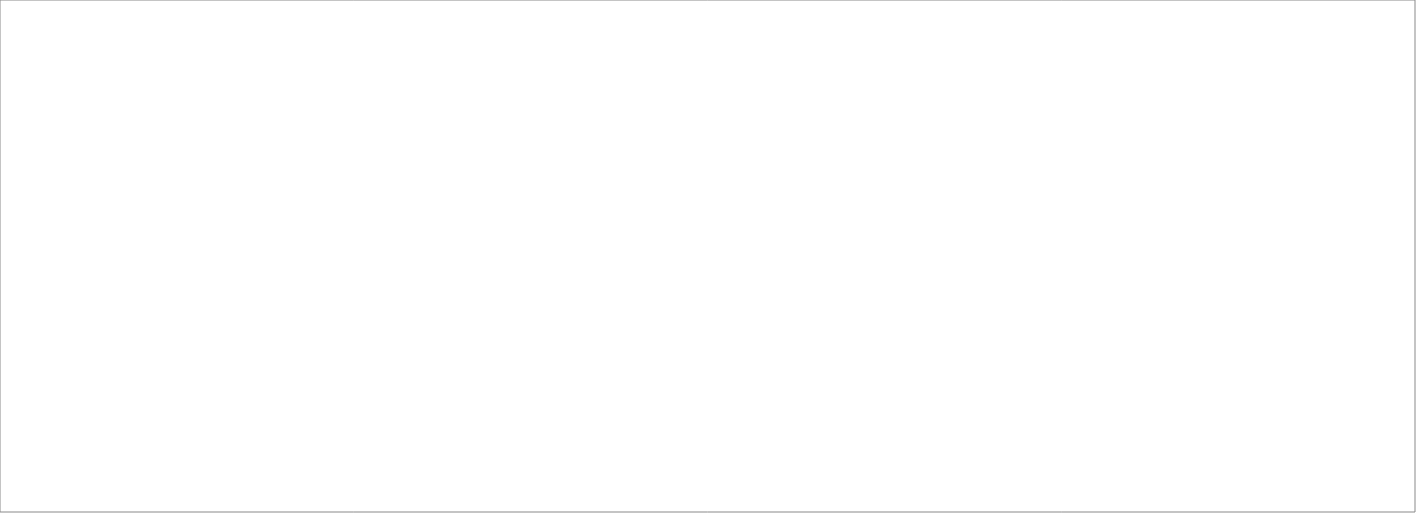
| Category | Total |
|---|---|
| Assessio Sverige AB | 100 |
| Michael Catenacci AB | 70 |
| Talogy Sweden AB | 70 |
| OnePartner Group AB | 70 |
| Source Executive Recruitment Sweden AB | 52.5 |